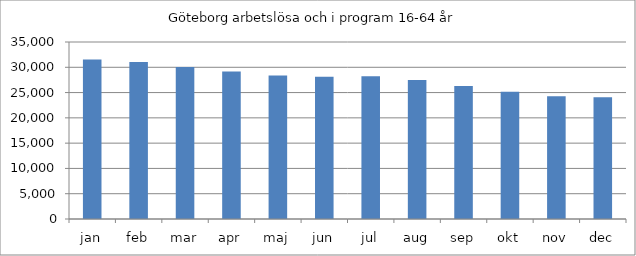
| Category | Göteborg |
|---|---|
| jan | 31548 |
| feb | 31044 |
| mar | 30032 |
| apr | 29151 |
| maj | 28378 |
| jun | 28107 |
| jul | 28242 |
| aug | 27490 |
| sep | 26320 |
| okt | 25149 |
| nov | 24249 |
| dec | 24076 |